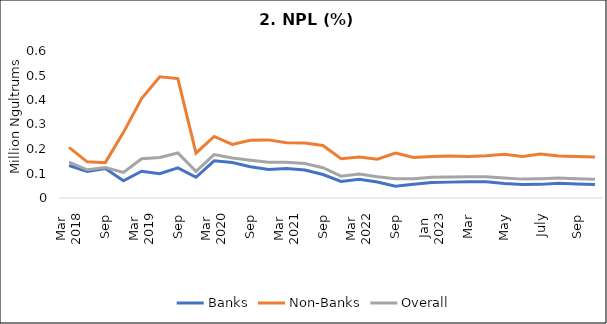
| Category | Banks | Non-Banks | Overall |
|---|---|---|---|
| 0 | 0.133 | 0.207 | 0.146 |
| 1 | 0.108 | 0.148 | 0.115 |
| 2 | 0.12 | 0.144 | 0.124 |
| 3 | 0.07 | 0.268 | 0.104 |
| 4 | 0.109 | 0.406 | 0.16 |
| 5 | 0.099 | 0.495 | 0.165 |
| 6 | 0.123 | 0.487 | 0.184 |
| 7 | 0.084 | 0.183 | 0.109 |
| 8 | 0.152 | 0.251 | 0.177 |
| 9 | 0.145 | 0.218 | 0.164 |
| 10 | 0.128 | 0.235 | 0.154 |
| 11 | 0.117 | 0.237 | 0.146 |
| 12 | 0.121 | 0.226 | 0.146 |
| 13 | 0.115 | 0.224 | 0.141 |
| 14 | 0.096 | 0.214 | 0.124 |
| 15 | 0.067 | 0.16 | 0.089 |
| 16 | 0.077 | 0.168 | 0.098 |
| 17 | 0.065 | 0.158 | 0.086 |
| 18 | 0.048 | 0.183 | 0.078 |
| 19 | 0.057 | 0.165 | 0.079 |
| 20 | 0.063 | 0.169 | 0.085 |
| 21 | 0.065 | 0.171 | 0.086 |
| 22 | 0.066 | 0.169 | 0.087 |
| 23 | 0.066 | 0.173 | 0.087 |
| 24 | 0.06 | 0.178 | 0.082 |
| 25 | 0.055 | 0.17 | 0.077 |
| 26 | 0.056 | 0.179 | 0.079 |
| 27 | 0.06 | 0.172 | 0.081 |
| 28 | 0.057 | 0.17 | 0.079 |
| 29 | 0.055 | 0.167 | 0.077 |